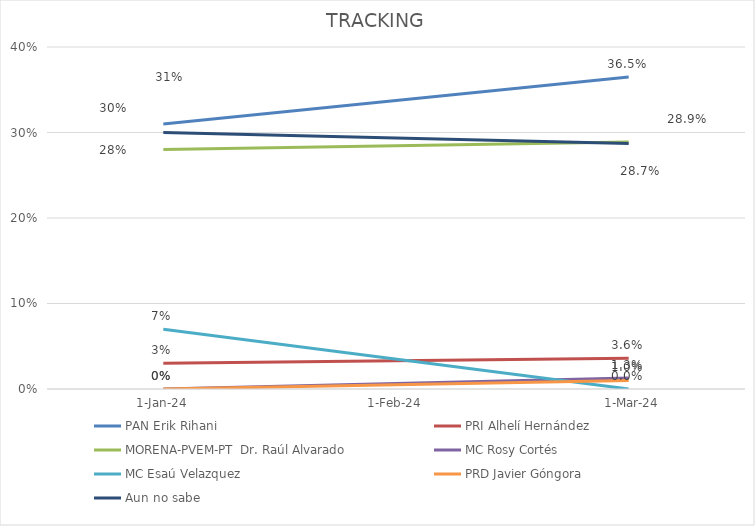
| Category | PAN Erik Rihani | PRI Alhelí Hernández | MORENA-PVEM-PT  Dr. Raúl Alvarado | MC Rosy Cortés | MC Esaú Velazquez | PRD Javier Góngora | Aun no sabe |
|---|---|---|---|---|---|---|---|
| 2024-01-24 | 0.31 | 0.03 | 0.28 | 0 | 0.07 | 0 | 0.3 |
| 2024-03-20 | 0.365 | 0.036 | 0.289 | 0.013 | 0 | 0.01 | 0.287 |